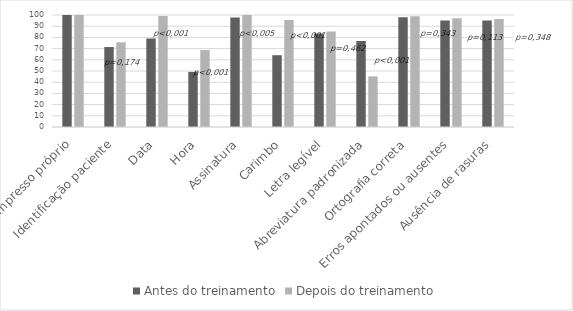
| Category | Antes do treinamento | Depois do treinamento |
|---|---|---|
| Impresso próprio | 100 | 100 |
| Identificação paciente | 71.4 | 75.6 |
| Data | 79.1 | 99.2 |
| Hora | 49.2 | 68.7 |
| Assinatura | 97.8 | 100 |
| Carimbo | 64.1 | 95.6 |
| Letra legível | 83.4 | 85.3 |
| Abreviatura padronizada | 76.8 | 45.2 |
| Ortografia correta | 98.1 | 98.9 |
| Erros apontados ou ausentes | 95.1 | 97.2 |
| Ausência de rasuras | 95.1 | 96.4 |